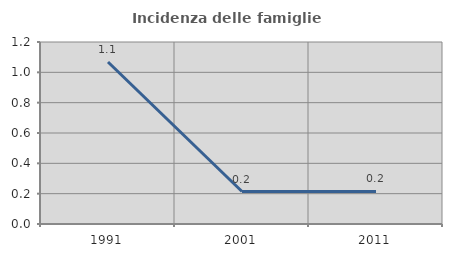
| Category | Incidenza delle famiglie numerose |
|---|---|
| 1991.0 | 1.068 |
| 2001.0 | 0.214 |
| 2011.0 | 0.215 |